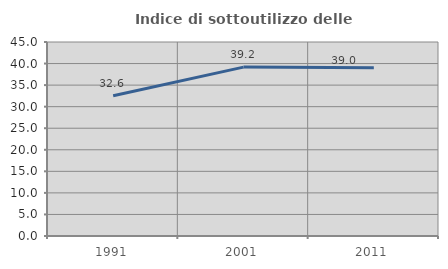
| Category | Indice di sottoutilizzo delle abitazioni  |
|---|---|
| 1991.0 | 32.55 |
| 2001.0 | 39.179 |
| 2011.0 | 39.049 |